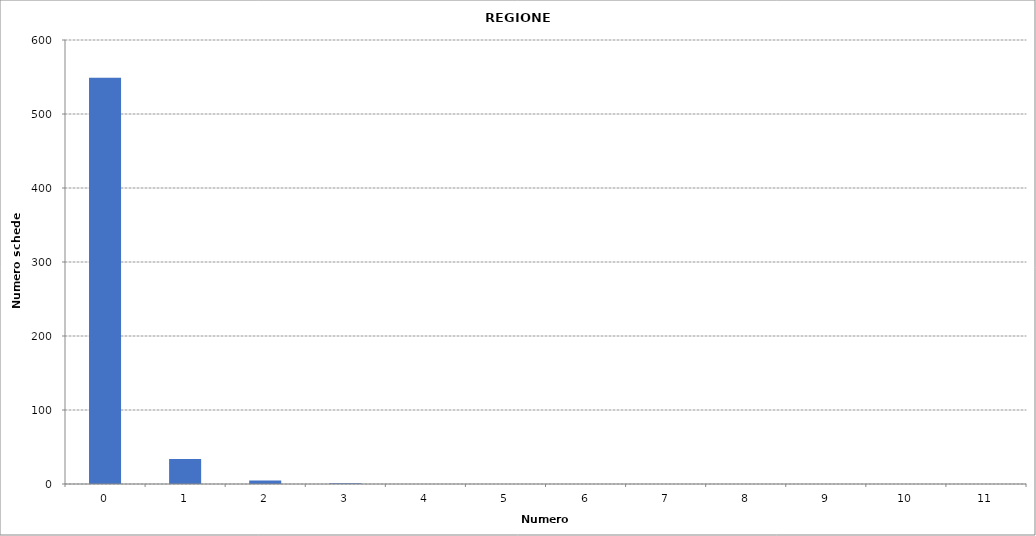
| Category | Series 0 |
|---|---|
| 0.0 | 549033 |
| 1.0 | 33644 |
| 2.0 | 4763 |
| 3.0 | 920 |
| 4.0 | 138 |
| 5.0 | 52 |
| 6.0 | 31 |
| 7.0 | 2 |
| 8.0 | 3 |
| 9.0 | 1 |
| 10.0 | 1 |
| 11.0 | 1 |